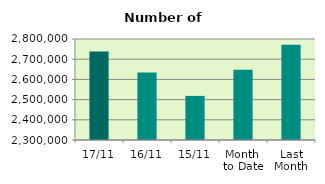
| Category | Series 0 |
|---|---|
| 17/11 | 2738570 |
| 16/11 | 2633816 |
| 15/11 | 2518342 |
| Month 
to Date | 2648193.385 |
| Last
Month | 2771381.143 |